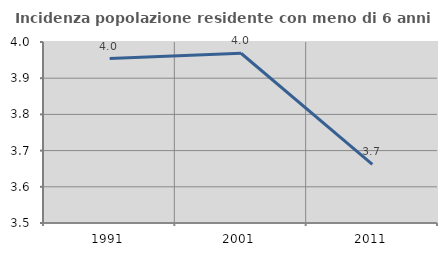
| Category | Incidenza popolazione residente con meno di 6 anni |
|---|---|
| 1991.0 | 3.954 |
| 2001.0 | 3.969 |
| 2011.0 | 3.662 |